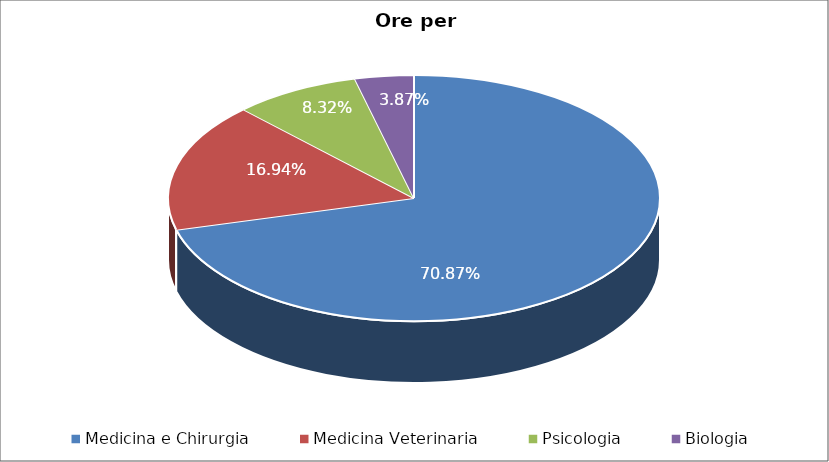
| Category | Series 0 |
|---|---|
| Medicina e Chirurgia | 3534.5 |
| Medicina Veterinaria | 845 |
| Psicologia | 415 |
| Biologia | 193 |